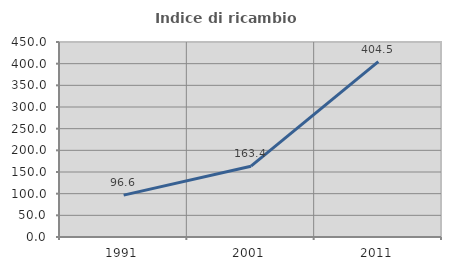
| Category | Indice di ricambio occupazionale  |
|---|---|
| 1991.0 | 96.61 |
| 2001.0 | 163.415 |
| 2011.0 | 404.545 |